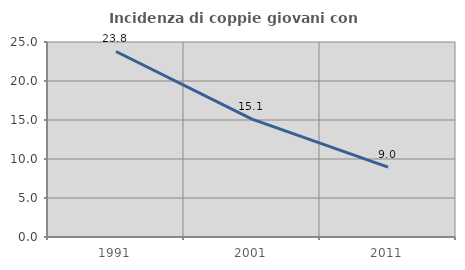
| Category | Incidenza di coppie giovani con figli |
|---|---|
| 1991.0 | 23.786 |
| 2001.0 | 15.109 |
| 2011.0 | 8.968 |